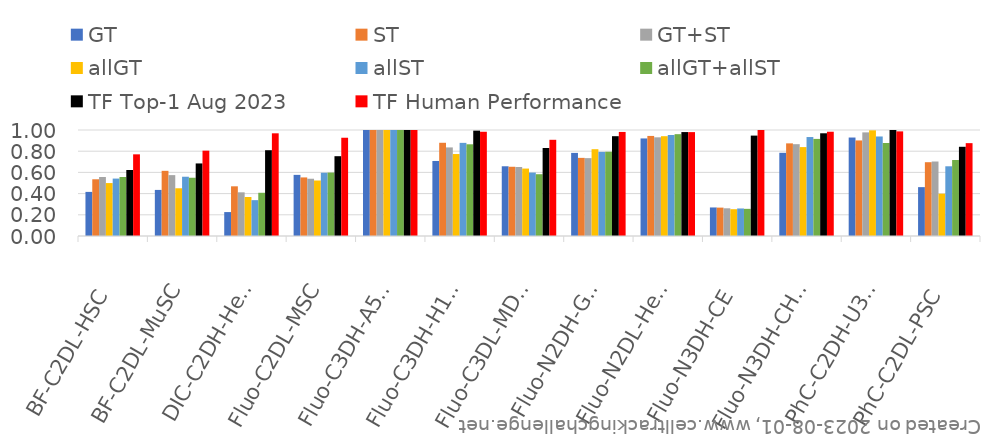
| Category | GT | ST | GT+ST | allGT | allST | allGT+allST | TF Top-1 Aug 2023 | TF Human Performance |
|---|---|---|---|---|---|---|---|---|
| BF-C2DL-HSC | 0.416 | 0.535 | 0.557 | 0.499 | 0.542 | 0.557 | 0.623 | 0.77 |
| BF-C2DL-MuSC | 0.435 | 0.615 | 0.574 | 0.45 | 0.559 | 0.55 | 0.685 | 0.805 |
| DIC-C2DH-HeLa | 0.226 | 0.469 | 0.412 | 0.368 | 0.338 | 0.408 | 0.809 | 0.969 |
| Fluo-C2DL-MSC | 0.577 | 0.553 | 0.54 | 0.524 | 0.597 | 0.599 | 0.753 | 0.927 |
| Fluo-C3DH-A549 | 1 | 1 | 1 | 1 | 1 | 1 | 1 | 1 |
| Fluo-C3DH-H157 | 0.708 | 0.879 | 0.836 | 0.773 | 0.879 | 0.865 | 0.994 | 0.984 |
| Fluo-C3DL-MDA231 | 0.658 | 0.653 | 0.651 | 0.636 | 0.598 | 0.583 | 0.83 | 0.908 |
| Fluo-N2DH-GOWT1 | 0.784 | 0.737 | 0.735 | 0.819 | 0.794 | 0.795 | 0.942 | 0.982 |
| Fluo-N2DL-HeLa | 0.92 | 0.944 | 0.931 | 0.942 | 0.953 | 0.961 | 0.98 | 0.98 |
| Fluo-N3DH-CE | 0.269 | 0.268 | 0.261 | 0.253 | 0.26 | 0.256 | 0.947 | 1 |
| Fluo-N3DH-CHO | 0.785 | 0.874 | 0.866 | 0.839 | 0.934 | 0.916 | 0.969 | 0.984 |
| PhC-C2DH-U373 | 0.929 | 0.901 | 0.978 | 0.997 | 0.939 | 0.877 | 1 | 0.987 |
| PhC-C2DL-PSC | 0.461 | 0.696 | 0.703 | 0.399 | 0.658 | 0.717 | 0.842 | 0.876 |